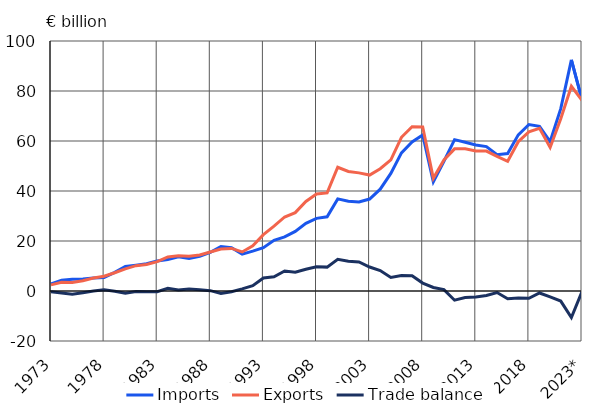
| Category | Imports | Exports | Trade balance |
|---|---|---|---|
| 1973 | 2.792 | 2.456 | -0.336 |
| 1974 | 4.317 | 3.479 | -0.838 |
| 1975 | 4.71 | 3.405 | -1.304 |
| 1976 | 4.803 | 4.121 | -0.681 |
| 1977 | 5.165 | 5.202 | 0.038 |
| 1978 | 5.439 | 5.921 | 0.482 |
| 1979 | 7.438 | 7.304 | -0.133 |
| 1980 | 9.797 | 8.879 | -0.918 |
| 1981 | 10.305 | 10.143 | -0.162 |
| 1982 | 10.89 | 10.6 | -0.29 |
| 1983 | 12.03 | 11.721 | -0.309 |
| 1984 | 12.561 | 13.607 | 1.047 |
| 1985 | 13.711 | 14.132 | 0.422 |
| 1986 | 13.052 | 13.889 | 0.837 |
| 1987 | 13.927 | 14.383 | 0.456 |
| 1988 | 15.493 | 15.625 | 0.132 |
| 1989 | 17.746 | 16.782 | -0.964 |
| 1990 | 17.327 | 17.042 | -0.285 |
| 1991 | 14.757 | 15.615 | 0.857 |
| 1992 | 15.969 | 18.074 | 2.105 |
| 1993 | 17.351 | 22.556 | 5.205 |
| 1994 | 20.274 | 25.928 | 5.654 |
| 1995 | 21.621 | 29.605 | 7.983 |
| 1996 | 23.836 | 31.339 | 7.504 |
| 1997 | 27.077 | 35.797 | 8.72 |
| 1998 | 29.066 | 38.779 | 9.713 |
| 1999 | 29.691 | 39.246 | 9.554 |
| 2000 | 36.837 | 49.484 | 12.647 |
| 2001 | 35.891 | 47.8 | 11.91 |
| 2002 | 35.611 | 47.245 | 11.634 |
| 2003 | 36.775 | 46.378 | 9.604 |
| 2004 | 40.73 | 48.917 | 8.187 |
| 2005 | 47.027 | 52.453 | 5.426 |
| 2006 | 55.253 | 61.489 | 6.237 |
| 2007 | 59.616 | 65.688 | 6.072 |
| 2008 | 62.402 | 65.58 | 3.178 |
| 2009 | 43.655 | 45.063 | 1.409 |
| 2010 | 51.899 | 52.439 | 0.539 |
| 2011 | 60.535 | 56.855 | -3.68 |
| 2012 | 59.517 | 56.878 | -2.639 |
| 2013 | 58.407 | 56.048 | -2.359 |
| 2014 | 57.769 | 55.973 | -1.796 |
| 2015 | 54.493 | 53.88 | -0.613 |
| 2016 | 55.003 | 51.878 | -3.125 |
| 2017 | 62.469 | 59.711 | -2.758 |
| 2018 | 66.585 | 63.682 | -2.903 |
| 2019 | 65.851 | 65.054 | -0.797 |
| 2020 | 59.768 | 57.44 | -2.328 |
| 2021 | 72.936 | 68.908 | -4.027 |
| 2022 | 92.469 | 81.885 | -10.585 |
| 2023* | 76.508 | 76.245 | -0.263 |